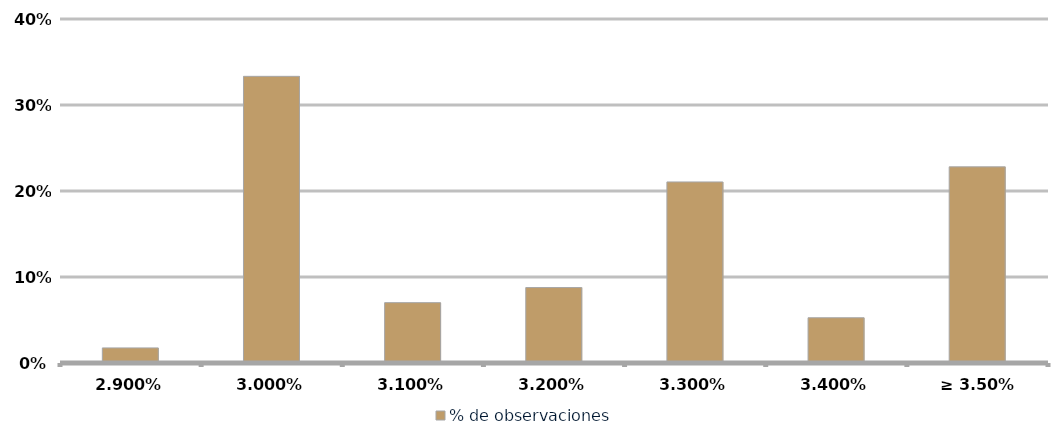
| Category | % de observaciones  |
|---|---|
| 2.90% | 0.018 |
| 3.00% | 0.333 |
| 3.10% | 0.07 |
| 3.20% | 0.088 |
| 3.30% | 0.211 |
| 3.40% | 0.053 |
| ≥ 3.50% | 0.228 |